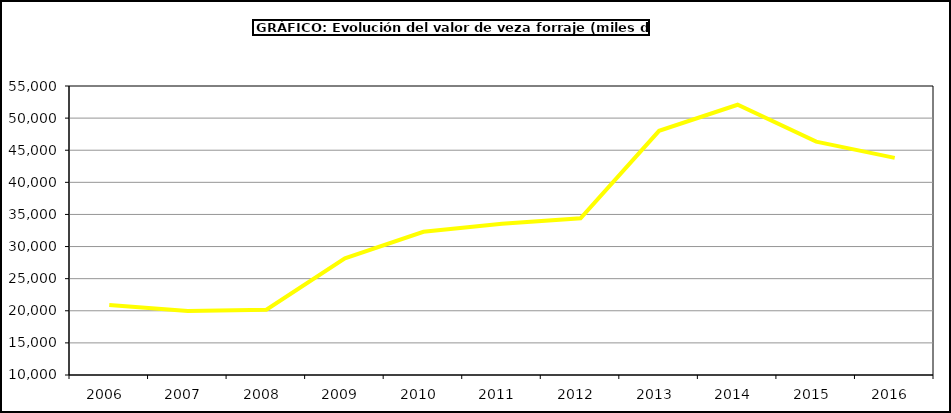
| Category | Valor |
|---|---|
| 2006.0 | 20881.991 |
| 2007.0 | 19961.228 |
| 2008.0 | 20170.083 |
| 2009.0 | 28162.401 |
| 2010.0 | 32296.558 |
| 2011.0 | 33540.553 |
| 2012.0 | 34393.555 |
| 2013.0 | 48025.512 |
| 2014.0 | 52077.137 |
| 2015.0 | 46338 |
| 2016.0 | 43806 |